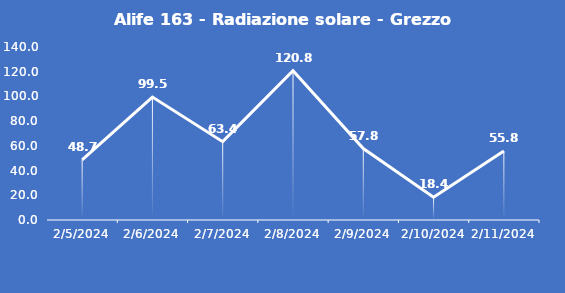
| Category | Alife 163 - Radiazione solare - Grezzo (W/m2) |
|---|---|
| 2/5/24 | 48.7 |
| 2/6/24 | 99.5 |
| 2/7/24 | 63.4 |
| 2/8/24 | 120.8 |
| 2/9/24 | 57.8 |
| 2/10/24 | 18.4 |
| 2/11/24 | 55.8 |